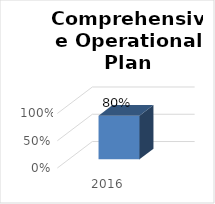
| Category | Series 0 |
|---|---|
| 2016.0 | 0.8 |